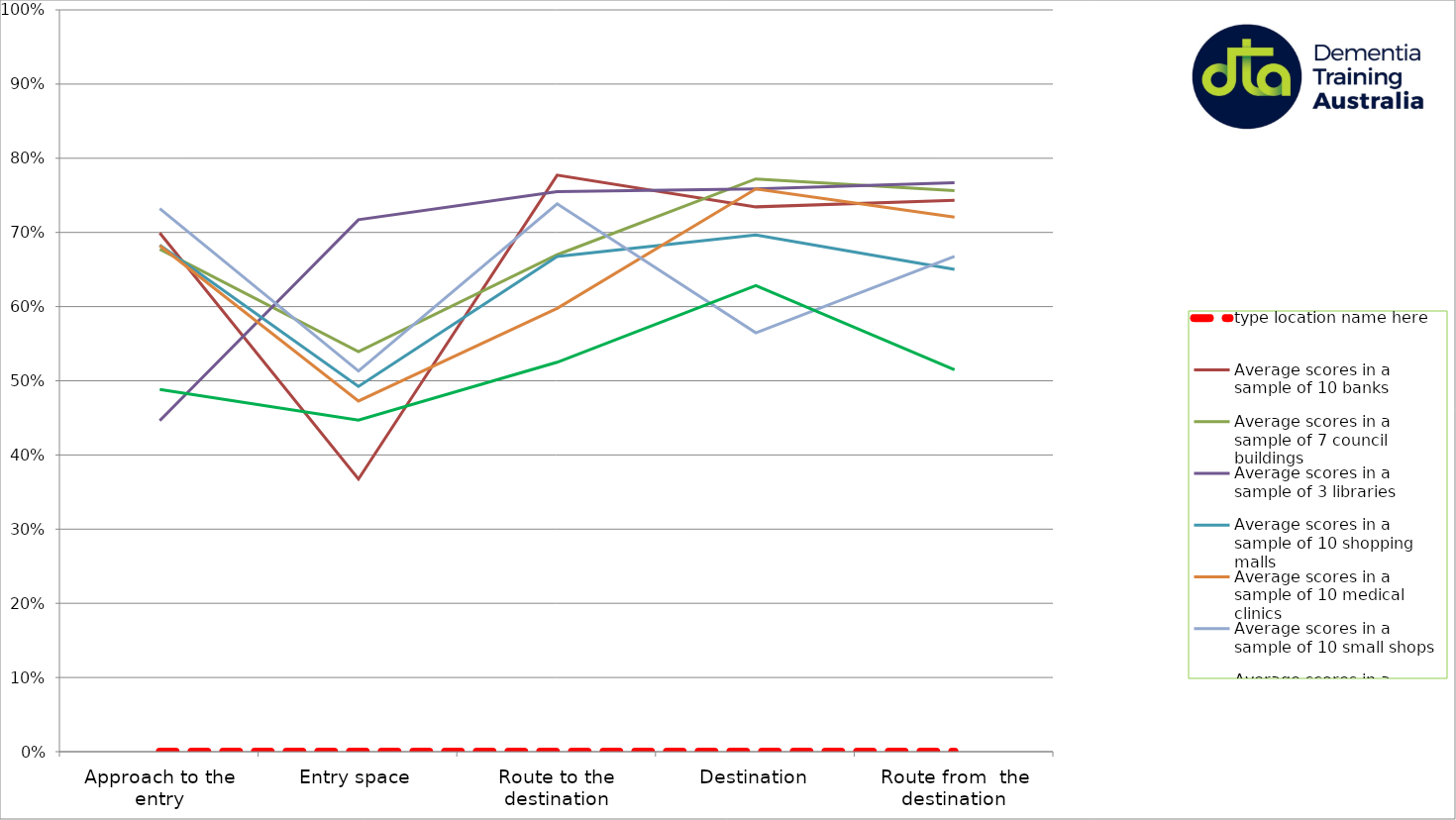
| Category | type location name here | Average scores in a sample of 10 banks | Average scores in a sample of 7 council buildings | Average scores in a sample of 3 libraries | Average scores in a sample of 10 shopping malls | Average scores in a sample of 10 medical clinics | Average scores in a sample of 10 small shops | Average scores in a sample of 10 supermarkets |
|---|---|---|---|---|---|---|---|---|
| Approach to the entry | 0 | 0.699 | 0.677 | 0.446 | 0.683 | 0.682 | 0.732 | 0.488 |
| Entry space | 0 | 0.367 | 0.539 | 0.717 | 0.492 | 0.473 | 0.513 | 0.447 |
| Route to the destination | 0 | 0.777 | 0.67 | 0.755 | 0.668 | 0.598 | 0.739 | 0.525 |
| Destination | 0 | 0.734 | 0.772 | 0.759 | 0.697 | 0.759 | 0.565 | 0.628 |
| Route from  the destination | 0 | 0.743 | 0.756 | 0.767 | 0.65 | 0.721 | 0.668 | 0.515 |